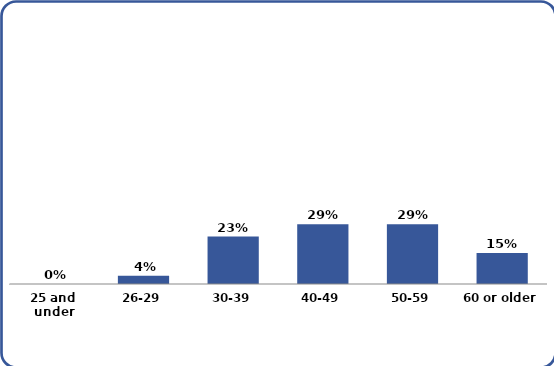
| Category | Series 0 |
|---|---|
| 25 and under | 0 |
| 26-29 | 0.04 |
| 30-39 | 0.23 |
| 40-49 | 0.29 |
| 50-59 | 0.29 |
| 60 or older | 0.15 |